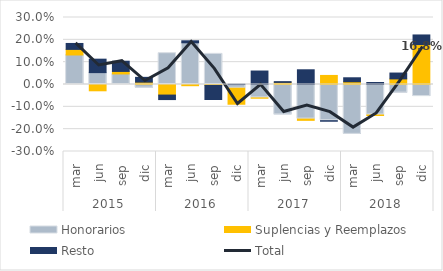
| Category | Honorarios | Suplencias y Reemplazos | Resto |
|---|---|---|---|
| 0 | 0.132 | 0.025 | 0.027 |
| 1 | 0.053 | -0.028 | 0.06 |
| 2 | 0.047 | 0.011 | 0.046 |
| 3 | -0.016 | 0.011 | 0.021 |
| 4 | 0.14 | -0.047 | -0.02 |
| 5 | 0.187 | -0.005 | 0.009 |
| 6 | 0.137 | -0.004 | -0.063 |
| 7 | -0.017 | -0.072 | 0.001 |
| 8 | -0.06 | -0.001 | 0.06 |
| 9 | -0.136 | 0.009 | 0.003 |
| 10 | -0.155 | -0.006 | 0.066 |
| 11 | -0.162 | 0.041 | -0.003 |
| 12 | -0.223 | 0.012 | 0.018 |
| 13 | -0.137 | -0.002 | 0.009 |
| 14 | -0.039 | 0.025 | 0.026 |
| 15 | -0.054 | 0.179 | 0.043 |